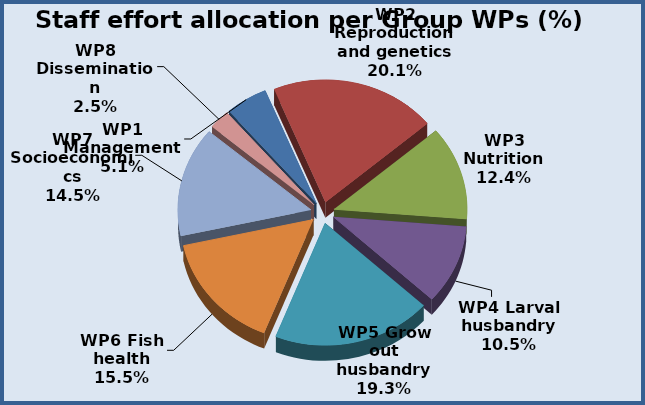
| Category | Series 0 |
|---|---|
| WP1 Management | 5.102 |
| WP2 Reproduction and genetics | 20.148 |
| WP3 Nutrition | 12.393 |
| WP4 Larval husbandry | 10.51 |
| WP5 Grow out husbandry | 19.283 |
| WP6 Fish health | 15.52 |
| WP7 Socioeconomics | 14.524 |
| WP8 Dissemination | 2.52 |